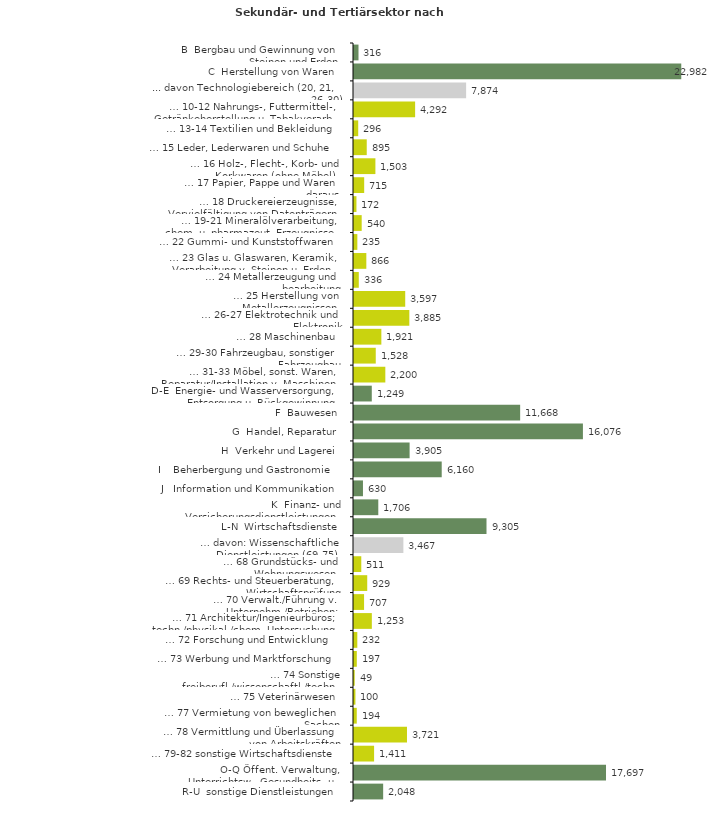
| Category | Series 0 |
|---|---|
| B  Bergbau und Gewinnung von Steinen und Erden | 316 |
| C  Herstellung von Waren | 22982 |
| ... davon Technologiebereich (20, 21, 26-30) | 7874 |
| … 10-12 Nahrungs-, Futtermittel-, Getränkeherstellung u. Tabakverarb. | 4292 |
| … 13-14 Textilien und Bekleidung | 296 |
| … 15 Leder, Lederwaren und Schuhe | 895 |
| … 16 Holz-, Flecht-, Korb- und Korkwaren (ohne Möbel)  | 1503 |
| … 17 Papier, Pappe und Waren daraus  | 715 |
| … 18 Druckereierzeugnisse, Vervielfältigung von Datenträgern | 172 |
| … 19-21 Mineralölverarbeitung, chem. u. pharmazeut. Erzeugnisse | 540 |
| … 22 Gummi- und Kunststoffwaren | 235 |
| … 23 Glas u. Glaswaren, Keramik, Verarbeitung v. Steinen u. Erden  | 866 |
| … 24 Metallerzeugung und -bearbeitung | 336 |
| … 25 Herstellung von Metallerzeugnissen  | 3597 |
| … 26-27 Elektrotechnik und Elektronik | 3885 |
| … 28 Maschinenbau | 1921 |
| … 29-30 Fahrzeugbau, sonstiger Fahrzeugbau | 1528 |
| … 31-33 Möbel, sonst. Waren, Reparatur/Installation v. Maschinen | 2200 |
| D-E  Energie- und Wasserversorgung, Entsorgung u. Rückgewinnung | 1249 |
| F  Bauwesen | 11668 |
| G  Handel, Reparatur | 16076 |
| H  Verkehr und Lagerei | 3905 |
| I    Beherbergung und Gastronomie | 6160 |
| J   Information und Kommunikation | 630 |
| K  Finanz- und Versicherungsdienstleistungen | 1706 |
| L-N  Wirtschaftsdienste | 9305 |
| … davon: Wissenschaftliche Dienstleistungen (69-75) | 3467 |
| … 68 Grundstücks- und Wohnungswesen  | 511 |
| … 69 Rechts- und Steuerberatung, Wirtschaftsprüfung | 929 |
| … 70 Verwalt./Führung v. Unternehm./Betrieben; Unternehmensberat. | 707 |
| … 71 Architektur/Ingenieurbüros; techn./physikal./chem. Untersuchung | 1253 |
| … 72 Forschung und Entwicklung  | 232 |
| … 73 Werbung und Marktforschung | 197 |
| … 74 Sonstige freiberufl./wissenschaftl./techn. Tätigkeiten | 49 |
| … 75 Veterinärwesen | 100 |
| … 77 Vermietung von beweglichen Sachen  | 194 |
| … 78 Vermittlung und Überlassung von Arbeitskräften | 3721 |
| … 79-82 sonstige Wirtschaftsdienste | 1411 |
| O-Q Öffent. Verwaltung, Unterrichtsw., Gesundheits- u. Sozialwesen | 17697 |
| R-U  sonstige Dienstleistungen | 2048 |